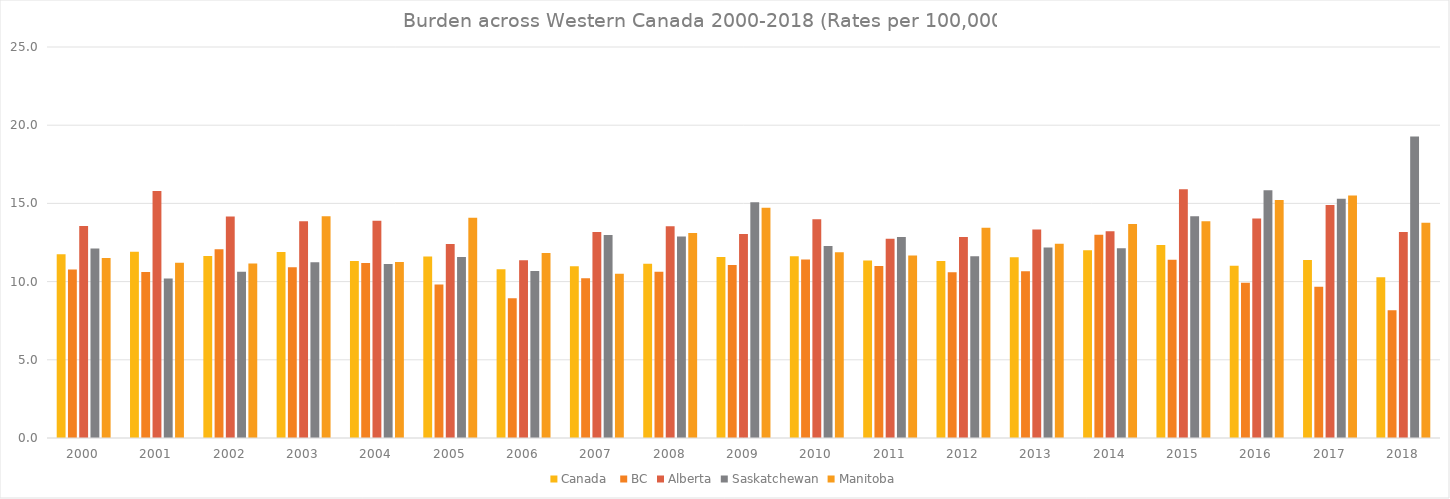
| Category | Canada  | BC | Alberta | Saskatchewan | Manitoba |
|---|---|---|---|---|---|
| 2000.0 | 11.751 | 10.769 | 13.548 | 12.108 | 11.505 |
| 2001.0 | 11.902 | 10.621 | 15.794 | 10.198 | 11.203 |
| 2002.0 | 11.639 | 12.072 | 14.16 | 10.634 | 11.153 |
| 2003.0 | 11.898 | 10.91 | 13.855 | 11.241 | 14.18 |
| 2004.0 | 11.312 | 11.19 | 13.895 | 11.13 | 11.251 |
| 2005.0 | 11.608 | 9.819 | 12.403 | 11.575 | 14.089 |
| 2006.0 | 10.783 | 8.935 | 11.37 | 10.682 | 11.829 |
| 2007.0 | 10.979 | 10.207 | 13.175 | 12.973 | 10.509 |
| 2008.0 | 11.144 | 10.622 | 13.543 | 12.876 | 13.108 |
| 2009.0 | 11.567 | 11.064 | 13.047 | 15.075 | 14.728 |
| 2010.0 | 11.619 | 11.421 | 13.987 | 12.269 | 11.878 |
| 2011.0 | 11.346 | 10.995 | 12.747 | 12.851 | 11.673 |
| 2012.0 | 11.309 | 10.598 | 12.853 | 11.626 | 13.44 |
| 2013.0 | 11.555 | 10.669 | 13.338 | 12.185 | 12.415 |
| 2014.0 | 12.004 | 13.002 | 13.223 | 12.13 | 13.682 |
| 2015.0 | 12.338 | 11.389 | 15.901 | 14.184 | 13.852 |
| 2016.0 | 11.016 | 9.919 | 14.037 | 15.845 | 15.219 |
| 2017.0 | 11.376 | 9.671 | 14.892 | 15.294 | 15.501 |
| 2018.0 | 10.284 | 8.174 | 13.164 | 19.276 | 13.756 |